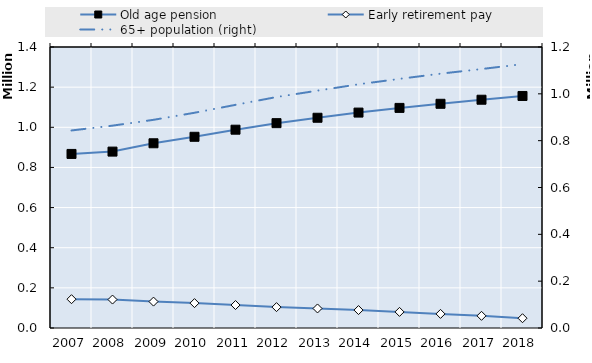
| Category | Old age pension | Early retirement pay | 0 | Series 14 | Series 15 | Series 16 | Series 17 | Series 18 | Series 19 |
|---|---|---|---|---|---|---|---|---|---|
| 2007.0 | 867243 | 143621 |  |  |  |  |  |  |  |
| 2008.0 | 878845 | 141755 |  |  |  |  |  |  |  |
| 2009.0 | 920357 | 131552.75 |  |  |  |  |  |  |  |
| 2010.0 | 952628 | 123953.5 |  |  |  |  |  |  |  |
| 2011.0 | 988018 | 114377 |  |  |  |  |  |  |  |
| 2012.0 | 1020581 | 104071 |  |  |  |  |  |  |  |
| 2013.0 | 1047453 | 97360.25 |  |  |  |  |  |  |  |
| 2014.0 | 1073252 | 89340.25 |  |  |  |  |  |  |  |
| 2015.0 | 1096564 | 80231.75 |  |  |  |  |  |  |  |
| 2016.0 | 1117090 | 70260.5 |  |  |  |  |  |  |  |
| 2017.0 | 1137343 | 60527.75 |  |  |  |  |  |  |  |
| 2018.0 | 1155953 | 48748 |  |  |  |  |  |  |  |